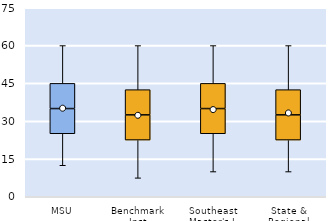
| Category | 25th | 50th | 75th |
|---|---|---|---|
| MSU | 25 | 10 | 10 |
| Benchmark Inst | 22.5 | 10 | 10 |
| Southeast Master's-L | 25 | 10 | 10 |
| State & Regional | 22.5 | 10 | 10 |